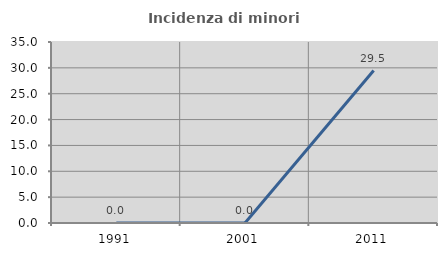
| Category | Incidenza di minori stranieri |
|---|---|
| 1991.0 | 0 |
| 2001.0 | 0 |
| 2011.0 | 29.487 |